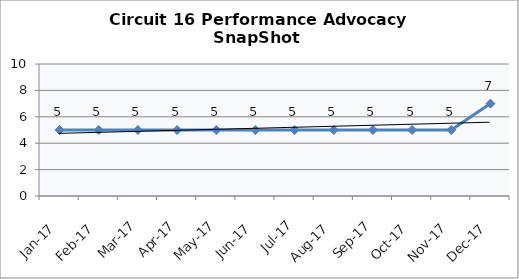
| Category | Circuit 16 |
|---|---|
| Jan-17 | 5 |
| Feb-17 | 5 |
| Mar-17 | 5 |
| Apr-17 | 5 |
| May-17 | 5 |
| Jun-17 | 5 |
| Jul-17 | 5 |
| Aug-17 | 5 |
| Sep-17 | 5 |
| Oct-17 | 5 |
| Nov-17 | 5 |
| Dec-17 | 7 |